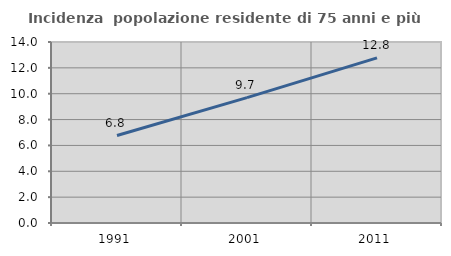
| Category | Incidenza  popolazione residente di 75 anni e più |
|---|---|
| 1991.0 | 6.764 |
| 2001.0 | 9.699 |
| 2011.0 | 12.769 |